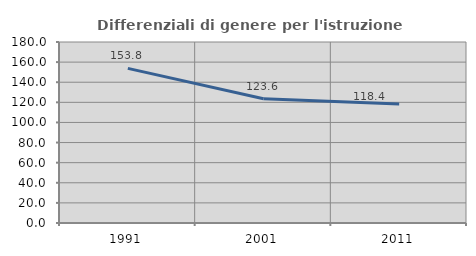
| Category | Differenziali di genere per l'istruzione superiore |
|---|---|
| 1991.0 | 153.805 |
| 2001.0 | 123.581 |
| 2011.0 | 118.36 |